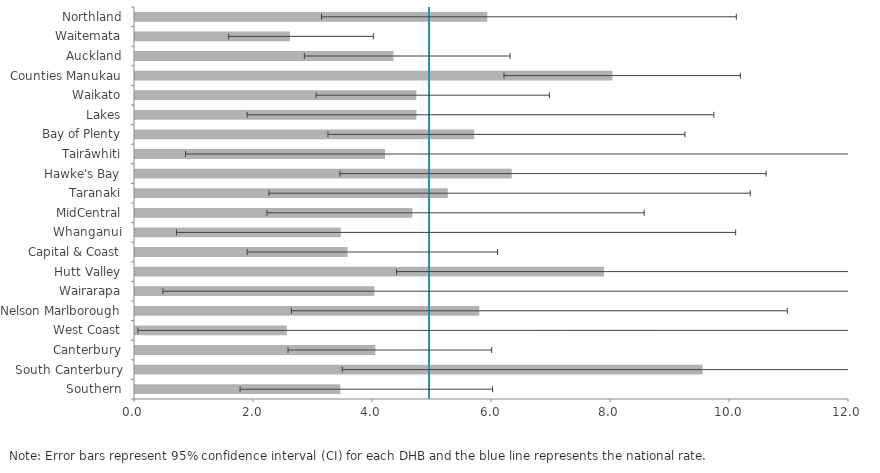
| Category | DHB |
|---|---|
| Northland | 5.92 |
| Waitemata | 2.605 |
| Auckland | 4.344 |
| Counties Manukau | 8.024 |
| Waikato | 4.729 |
| Lakes | 4.73 |
| Bay of Plenty | 5.702 |
| Tairāwhiti | 4.202 |
| Hawke's Bay | 6.332 |
| Taranaki | 5.256 |
| MidCentral | 4.662 |
| Whanganui | 3.46 |
| Capital & Coast | 3.573 |
| Hutt Valley | 7.882 |
| Wairarapa | 4.024 |
| Nelson Marlborough | 5.784 |
| West Coast | 2.551 |
| Canterbury | 4.04 |
| South Canterbury | 9.539 |
| Southern | 3.45 |